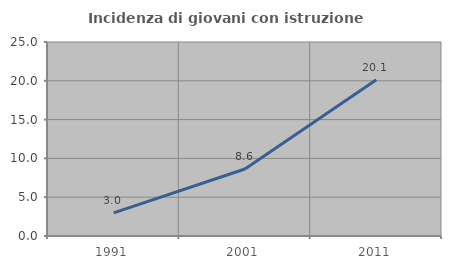
| Category | Incidenza di giovani con istruzione universitaria |
|---|---|
| 1991.0 | 2.981 |
| 2001.0 | 8.629 |
| 2011.0 | 20.126 |